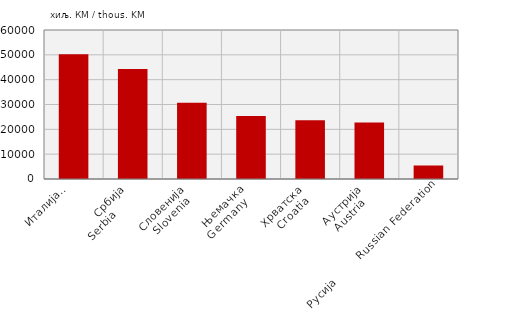
| Category | Извоз
Export |
|---|---|
| Италија
Italy   | 50222 |
| Србија
Serbia        | 44275 |
| Словенија
Slovenia  | 30691 |
| Њемачка
Germany   | 25381 |
| Хрватска
Croatia  | 23697 |
| Аустрија
Austria   | 22752 |
| Русија        Russian Federation | 5438 |